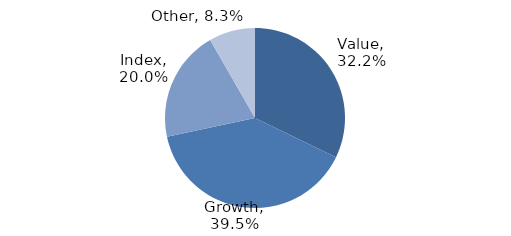
| Category | Investment Style |
|---|---|
| Value | 0.322 |
| Growth | 0.395 |
| Index | 0.2 |
| Other | 0.083 |